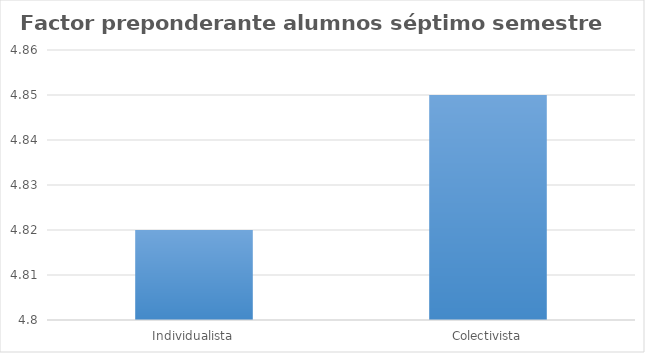
| Category | Series 0 |
|---|---|
| Individualista | 4.82 |
| Colectivista | 4.85 |